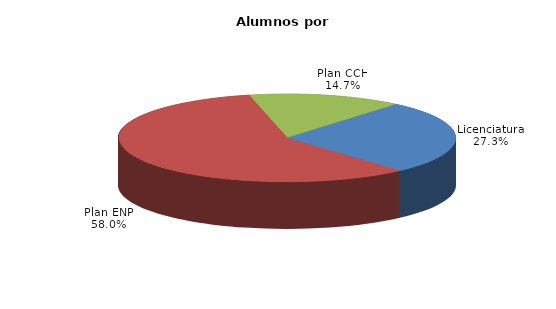
| Category | Series 0 |
|---|---|
| Licenciatura | 21029 |
| Plan ENP | 44764 |
| Plan CCH | 11366 |